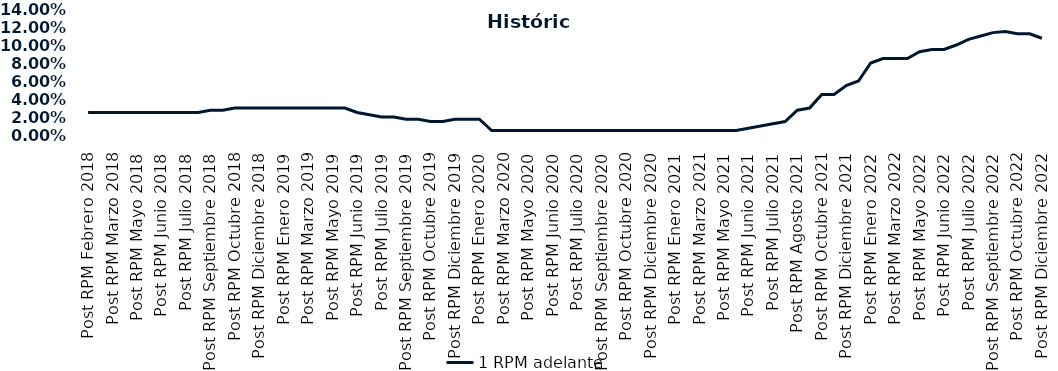
| Category | 1 RPM adelante |
|---|---|
| Post RPM Febrero 2018 | 0.025 |
| Pre RPM Marzo 2018 | 0.025 |
| Post RPM Marzo 2018 | 0.025 |
| Pre RPM Mayo 2018 | 0.025 |
| Post RPM Mayo 2018 | 0.025 |
| Pre RPM Junio 2018 | 0.025 |
| Post RPM Junio 2018 | 0.025 |
| Pre RPM Julio 2018 | 0.025 |
| Post RPM Julio 2018 | 0.025 |
| Pre RPM Septiembre 2018 | 0.025 |
| Post RPM Septiembre 2018 | 0.028 |
| Pre RPM Octubre 2018 | 0.028 |
| Post RPM Octubre 2018 | 0.03 |
| Pre RPM Diciembre 2018 | 0.03 |
| Post RPM Diciembre 2018 | 0.03 |
| Pre RPM Enero 2019 | 0.03 |
| Post RPM Enero 2019 | 0.03 |
| Pre RPM Marzo 2019 | 0.03 |
| Post RPM Marzo 2019 | 0.03 |
| Pre RPM Mayo 2019 | 0.03 |
| Post RPM Mayo 2019 | 0.03 |
| Pre RPM Junio 2019 | 0.03 |
| Post RPM Junio 2019 | 0.025 |
| Pre RPM Julio 2019 | 0.022 |
| Post RPM Julio 2019 | 0.02 |
| Pre RPM Septiembre 2019 | 0.02 |
| Post RPM Septiembre 2019 | 0.018 |
| Pre RPM Octubre 2019 | 0.018 |
| Post RPM Octubre 2019 | 0.015 |
| Pre RPM Diciembre 2019 | 0.015 |
| Post RPM Diciembre 2019 | 0.018 |
| Pre RPM Enero 2020 | 0.018 |
| Post RPM Enero 2020 | 0.018 |
| Pre RPM Marzo 2020 | 0.005 |
| Post RPM Marzo 2020 | 0.005 |
| Pre RPM Mayo 2020 | 0.005 |
| Post RPM Mayo 2020 | 0.005 |
| Pre RPM Junio 2020 | 0.005 |
| Post RPM Junio 2020 | 0.005 |
| Pre RPM Julio 2020 | 0.005 |
| Post RPM Julio 2020 | 0.005 |
| Pre RPM Septiembre 2020 | 0.005 |
| Post RPM Septiembre 2020 | 0.005 |
| Pre RPM Octubre 2020 | 0.005 |
| Post RPM Octubre 2020 | 0.005 |
| Pre RPM Diciembre 2020 | 0.005 |
| Post RPM Diciembre 2020 | 0.005 |
| Pre RPM Enero 2021 | 0.005 |
| Post RPM Enero 2021 | 0.005 |
| Pre RPM Marzo 2021 | 0.005 |
| Post RPM Marzo 2021 | 0.005 |
| Pre RPM Mayo 2021 | 0.005 |
| Post RPM Mayo 2021 | 0.005 |
| Pre RPM Junio 2021 | 0.005 |
| Post RPM Junio 2021 | 0.008 |
| Pre RPM Julio 2021 | 0.01 |
| Post RPM Julio 2021 | 0.012 |
| Pre RPM Agosto 2021 | 0.015 |
| Post RPM Agosto 2021 | 0.028 |
| Pre RPM Octubre 2021 | 0.03 |
| Post RPM Octubre 2021 | 0.045 |
| Pre RPM Diciembre 2021 | 0.045 |
| Post RPM Diciembre 2021 | 0.055 |
| Pre RPM Enero 2022 | 0.06 |
| Post RPM Enero 2022 | 0.08 |
| Pre RPM Marzo 2022 | 0.085 |
| Post RPM Marzo 2022 | 0.085 |
| Pre RPM Mayo 2022 | 0.085 |
| Post RPM Mayo 2022 | 0.092 |
| Pre RPM Junio 2022 | 0.095 |
| Post RPM Junio 2022 | 0.095 |
| Pre RPM Julio 2022 | 0.1 |
| Post RPM Julio 2022 | 0.106 |
| Pre RPM Septiembre 2022 | 0.11 |
| Post RPM Septiembre 2022 | 0.114 |
| Pre RPM Octubre 2022 | 0.115 |
| Post RPM Octubre 2022 | 0.112 |
| Pre RPM Diciembre 2022 | 0.112 |
| Post RPM Diciembre 2022 | 0.108 |